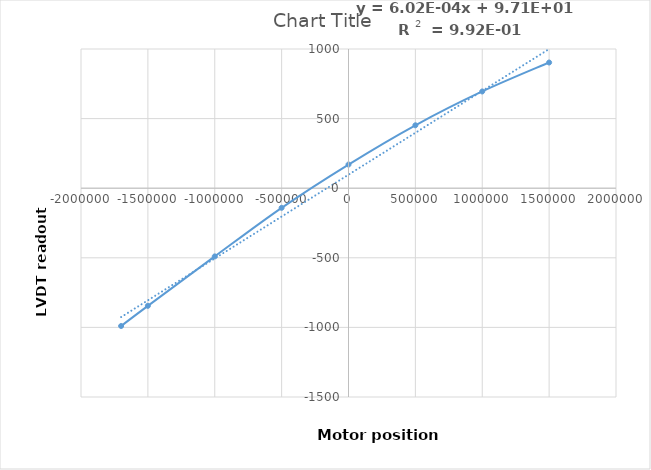
| Category | Series 0 |
|---|---|
| -1700000.0 | -990 |
| -1500000.0 | -845 |
| -1000000.0 | -490 |
| -500000.0 | -141 |
| 0.0 | 170 |
| 500000.0 | 452 |
| 1000000.0 | 695 |
| 1500000.0 | 903 |